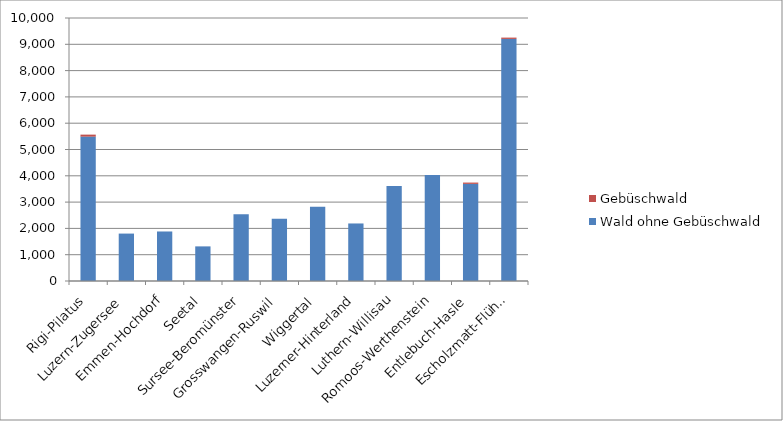
| Category | Wald ohne Gebüschwald | Gebüschwald |
|---|---|---|
| Rigi-Pilatus | 5490.1 | 75.6 |
| Luzern-Zugersee | 1803.1 | 0 |
| Emmen-Hochdorf | 1882.9 | 0 |
| Seetal | 1316.3 | 0 |
| Sursee-Beromünster | 2533.6 | 0 |
| Grosswangen-Ruswil | 2369.4 | 0 |
| Wiggertal | 2826.7 | 0 |
| Luzerner-Hinterland | 2187.7 | 0 |
| Luthern-Willisau | 3614.1 | 0 |
| Romoos-Werthenstein | 4031.4 | 0 |
| Entlebuch-Hasle | 3692.4 | 50.2 |
| Escholzmatt-Flühli | 9204.6 | 49.9 |